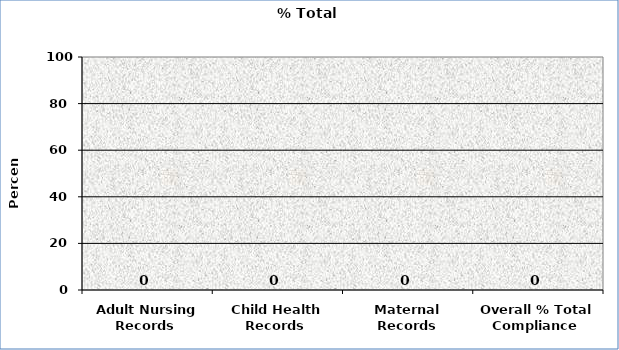
| Category | % Total Compliance |
|---|---|
| Adult Nursing Records  | 0 |
| Child Health Records  | 0 |
| Maternal Records | 0 |
| Overall % Total Compliance  | 0 |